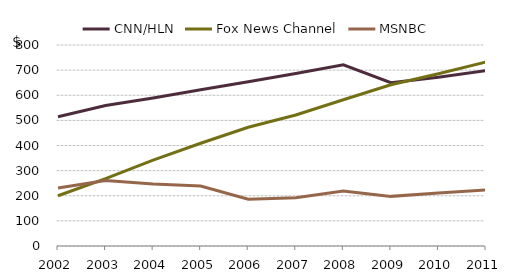
| Category | CNN/HLN | Fox News Channel | MSNBC |
|---|---|---|---|
| 2002.0 | 514.213 | 199.9 | 230.528 |
| 2003.0 | 558.973 | 267.975 | 260.645 |
| 2004.0 | 589.458 | 342.153 | 247.148 |
| 2005.0 | 622.215 | 408.922 | 238.802 |
| 2006.0 | 654.122 | 472.538 | 186.521 |
| 2007.0 | 686.295 | 521.431 | 191.734 |
| 2008.0 | 721.468 | 582.091 | 218.478 |
| 2009.0 | 649.737 | 641.75 | 197.528 |
| 2010.0 | 672.068 | 685.752 | 210.471 |
| 2011.0 | 698 | 732 | 223 |